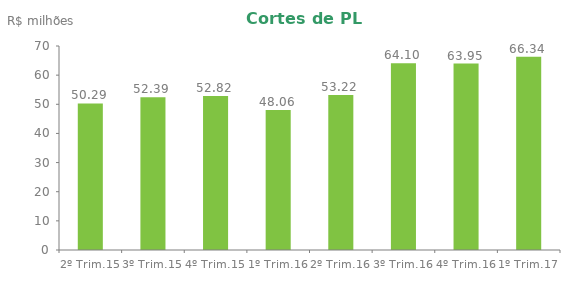
| Category | Series 0 |
|---|---|
| 2º Trim.15 | 50.294 |
| 3º Trim.15 | 52.388 |
| 4º Trim.15 | 52.817 |
| 1º Trim.16 | 48.055 |
| 2º Trim.16 | 53.218 |
| 3º Trim.16 | 64.103 |
| 4º Trim.16 | 63.955 |
| 1º Trim.17 | 66.342 |